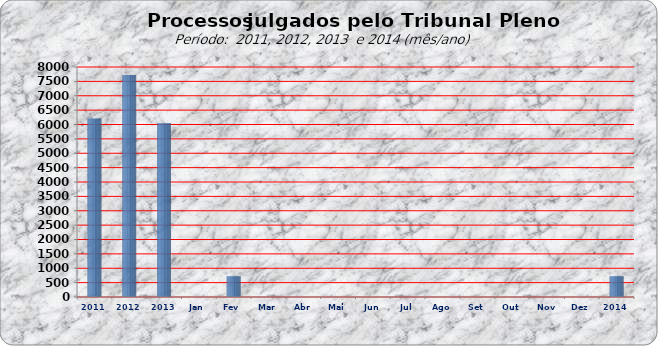
| Category | 6205 7722 6043 0 721 0 0 0 0 0 0 0 0 0 0 |
|---|---|
| 2011 | 6205 |
| 2012 | 7722 |
| 2013 | 6043 |
| Jan | 0 |
| Fev | 721 |
| Mar | 0 |
| Abr | 0 |
| Mai | 0 |
| Jun | 0 |
| Jul | 0 |
| Ago | 0 |
| Set | 0 |
| Out | 0 |
| Nov | 0 |
| Dez | 0 |
| 2014 | 721 |